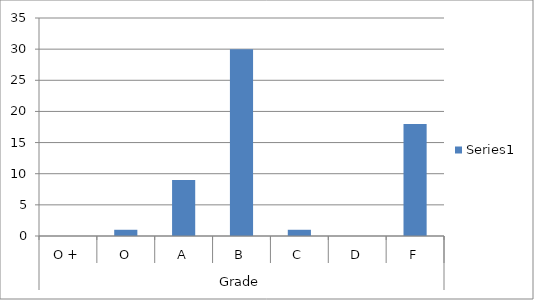
| Category | Series 0 |
|---|---|
| 0 | 0 |
| 1 | 1 |
| 2 | 9 |
| 3 | 30 |
| 4 | 1 |
| 5 | 0 |
| 6 | 18 |